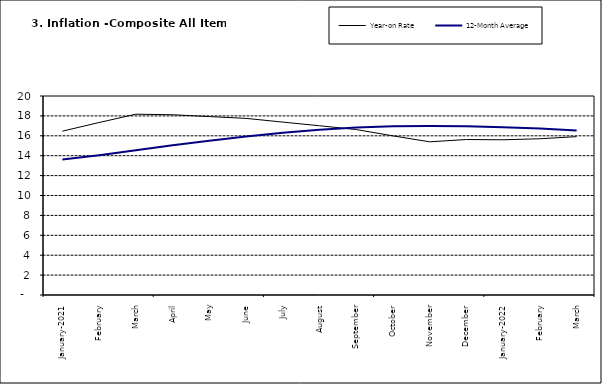
| Category | Year-on Rate | 12-Month Average |
|---|---|---|
| January-2021 | 16.466 | 13.616 |
| February | 17.335 | 14.053 |
| March | 18.171 | 14.554 |
| April | 18.117 | 15.039 |
| May | 17.933 | 15.499 |
| June | 17.751 | 15.927 |
| July | 17.377 | 16.298 |
| August | 17.009 | 16.601 |
| September | 16.63 | 16.83 |
| October | 15.994 | 16.958 |
| November | 15.396 | 16.979 |
| December | 15.625 | 16.953 |
| January-2022 | 15.601 | 16.869 |
| February | 15.702 | 16.728 |
| March | 15.915 | 16.544 |